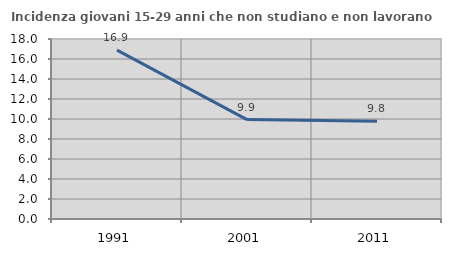
| Category | Incidenza giovani 15-29 anni che non studiano e non lavorano  |
|---|---|
| 1991.0 | 16.883 |
| 2001.0 | 9.945 |
| 2011.0 | 9.769 |